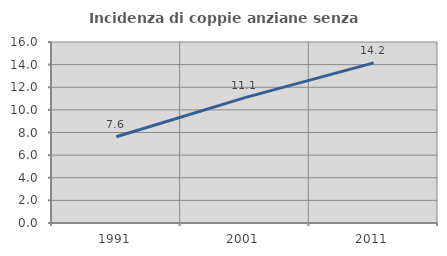
| Category | Incidenza di coppie anziane senza figli  |
|---|---|
| 1991.0 | 7.629 |
| 2001.0 | 11.082 |
| 2011.0 | 14.157 |